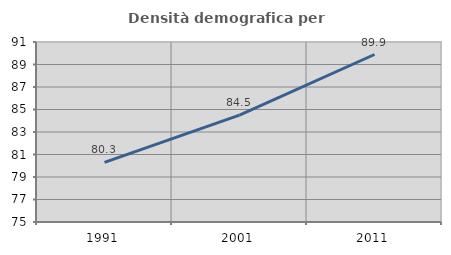
| Category | Densità demografica |
|---|---|
| 1991.0 | 80.299 |
| 2001.0 | 84.501 |
| 2011.0 | 89.889 |